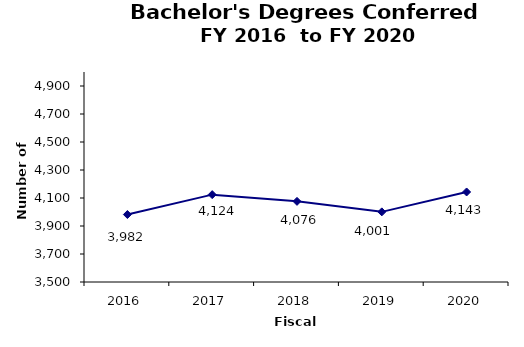
| Category | Series 0 |
|---|---|
| 2016.0 | 3982 |
| 2017.0 | 4124 |
| 2018.0 | 4076 |
| 2019.0 | 4001 |
| 2020.0 | 4143 |